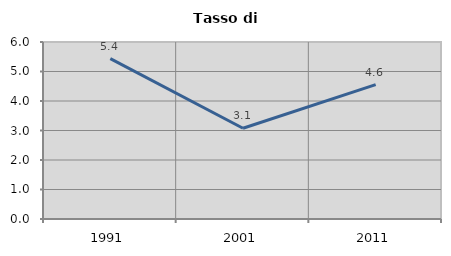
| Category | Tasso di disoccupazione   |
|---|---|
| 1991.0 | 5.435 |
| 2001.0 | 3.075 |
| 2011.0 | 4.553 |